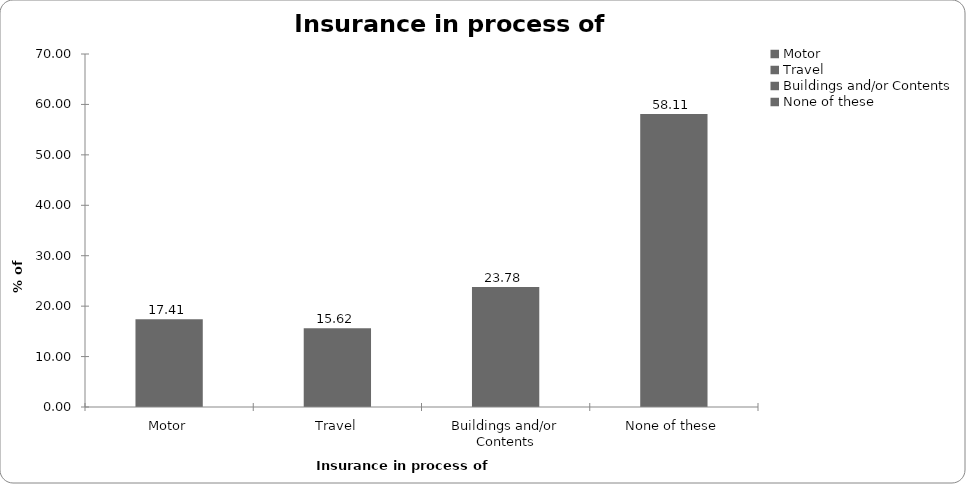
| Category | Insurance in process of buying |
|---|---|
| Motor | 17.413 |
| Travel | 15.622 |
| Buildings and/or Contents | 23.781 |
| None of these | 58.109 |